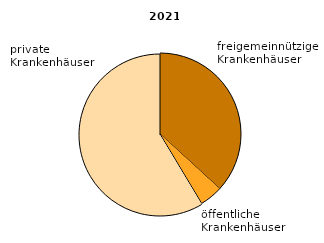
| Category | Series 0 |
|---|---|
| freigemeinnützige Krankenhäuser  | 36.8 |
| öffentliche Krankenhäuser  | 4.6 |
| private Krankenhäuser  | 58.6 |